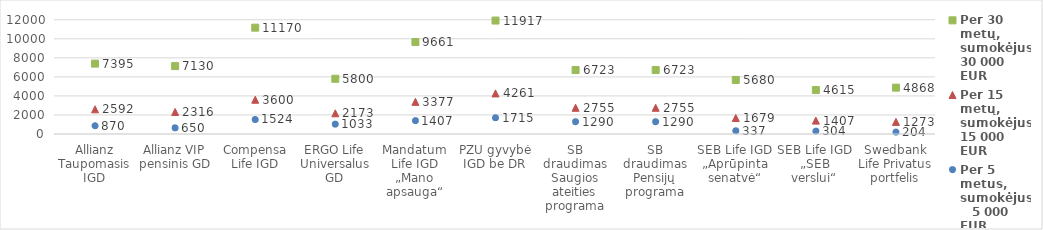
| Category | Per 30 metų, sumokėjus 30 000 EUR | Per 15 metų, sumokėjus 15 000 EUR | Per 5 metus, sumokėjus    5 000 EUR |
|---|---|---|---|
| Allianz Taupomasis IGD | 7395.49 | 2591.69 | 870.15 |
| Allianz VIP pensinis GD | 7130.4 | 2315.95 | 650.25 |
| Compensa Life IGD | 11169.899 | 3600.473 | 1524.083 |
| ERGO Life Universalus GD | 5800.32 | 2172.86 | 1032.8 |
| Mandatum Life IGD „Mano apsauga“ | 9661.38 | 3376.7 | 1407.03 |
| PZU gyvybė IGD be DR | 11916.823 | 4261.124 | 1714.943 |
| SB draudimas Saugios ateities programa | 6722.851 | 2754.524 | 1289.632 |
| SB draudimas Pensijų programa | 6722.851 | 2754.524 | 1289.632 |
| SEB Life IGD „Aprūpinta senatvė“ | 5679.785 | 1678.503 | 337.297 |
| SEB Life IGD „SEB verslui“ | 4614.622 | 1407.138 | 303.677 |
| Swedbank Life Privatus portfelis | 4868.14 | 1272.98 | 203.83 |